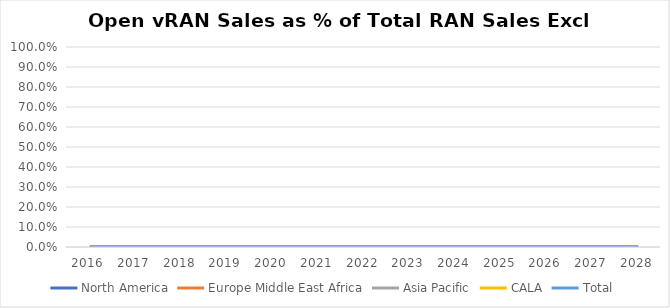
| Category | North America | Europe Middle East Africa | Asia Pacific | CALA | Total |
|---|---|---|---|---|---|
| 2016.0 | 0 | 0 | 0 | 0 | 0 |
| 2017.0 | 0 | 0 | 0 | 0 | 0 |
| 2018.0 | 0 | 0 | 0 | 0 | 0 |
| 2019.0 | 0 | 0 | 0 | 0 | 0 |
| 2020.0 | 0 | 0 | 0 | 0 | 0 |
| 2021.0 | 0 | 0 | 0 | 0 | 0 |
| 2022.0 | 0 | 0 | 0 | 0 | 0 |
| 2023.0 | 0 | 0 | 0 | 0 | 0 |
| 2024.0 | 0 | 0 | 0 | 0 | 0 |
| 2025.0 | 0 | 0 | 0 | 0 | 0 |
| 2026.0 | 0 | 0 | 0 | 0 | 0 |
| 2027.0 | 0 | 0 | 0 | 0 | 0 |
| 2028.0 | 0 | 0 | 0 | 0 | 0 |